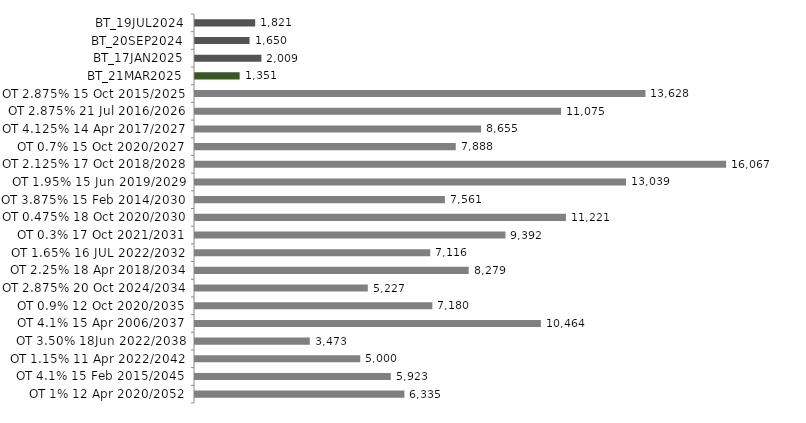
| Category | Series 0 |
|---|---|
| BT_19JUL2024 | 1820.712 |
| BT_20SEP2024 | 1650.193 |
| BT_17JAN2025 | 2008.562 |
| BT_21MAR2025 | 1350.602 |
| OT 2.875% 15 Oct 2015/2025 | 13627.591 |
| OT 2.875% 21 Jul 2016/2026 | 11075.196 |
| OT 4.125% 14 Apr 2017/2027 | 8655.046 |
| OT 0.7% 15 Oct 2020/2027 | 7888.456 |
| OT 2.125% 17 Oct 2018/2028 | 16067.387 |
| OT 1.95% 15 Jun 2019/2029 | 13038.995 |
| OT 3.875% 15 Feb 2014/2030 | 7560.513 |
| OT 0.475% 18 Oct 2020/2030 | 11221.218 |
| OT 0.3% 17 Oct 2021/2031 | 9391.526 |
| OT 1.65% 16 JUL 2022/2032 | 7115.935 |
| OT 2.25% 18 Apr 2018/2034 | 8279.46 |
| OT 2.875% 20 Oct 2024/2034 | 5226.86 |
| OT 0.9% 12 Oct 2020/2035 | 7180.159 |
| OT 4.1% 15 Apr 2006/2037 | 10463.59 |
| OT 3.50% 18Jun 2022/2038 | 3473.398 |
| OT 1.15% 11 Apr 2022/2042 | 4999.65 |
| OT 4.1% 15 Feb 2015/2045 | 5922.665 |
| OT 1% 12 Apr 2020/2052 | 6334.867 |